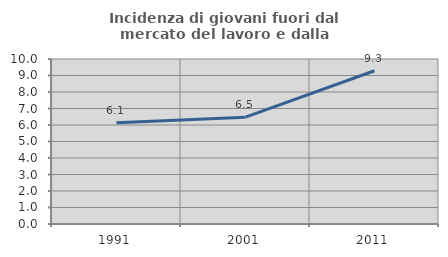
| Category | Incidenza di giovani fuori dal mercato del lavoro e dalla formazione  |
|---|---|
| 1991.0 | 6.134 |
| 2001.0 | 6.475 |
| 2011.0 | 9.287 |